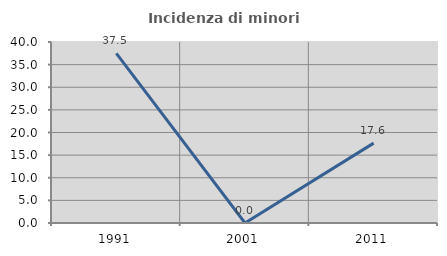
| Category | Incidenza di minori stranieri |
|---|---|
| 1991.0 | 37.5 |
| 2001.0 | 0 |
| 2011.0 | 17.647 |